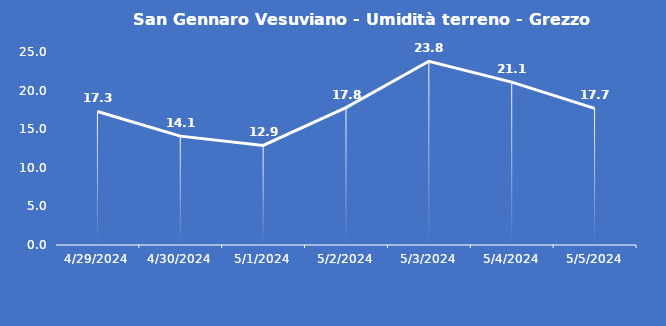
| Category | San Gennaro Vesuviano - Umidità terreno - Grezzo (%VWC) |
|---|---|
| 4/29/24 | 17.3 |
| 4/30/24 | 14.1 |
| 5/1/24 | 12.9 |
| 5/2/24 | 17.8 |
| 5/3/24 | 23.8 |
| 5/4/24 | 21.1 |
| 5/5/24 | 17.7 |